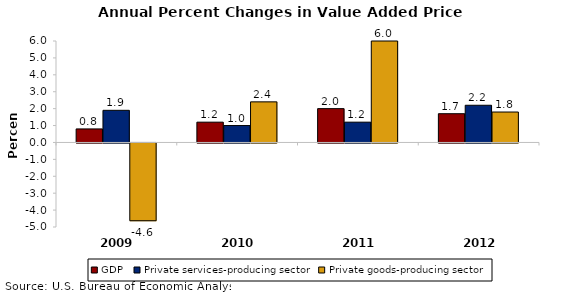
| Category | GDP | Private services-producing sector | Private goods-producing sector |
|---|---|---|---|
| 2009.0 | 0.8 | 1.9 | -4.6 |
| 2010.0 | 1.2 | 1 | 2.4 |
| 2011.0 | 2 | 1.2 | 6 |
| 2012.0 | 1.7 | 2.2 | 1.8 |